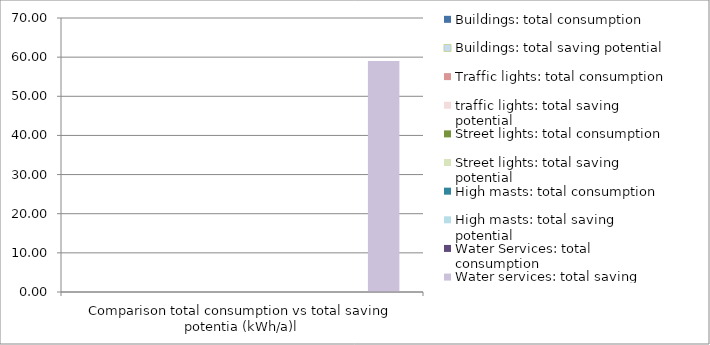
| Category | Buildings: total consumption | Buildings: total saving potential | Traffic lights: total consumption | traffic lights: total saving potential | Street lights: total consumption | Street lights: total saving potential | High masts: total consumption | High masts: total saving potential | Water Services: total consumption | Water services: total saving potential |
|---|---|---|---|---|---|---|---|---|---|---|
| 0 | 0 | 0 | 0 | 0 | 0 | 0 | 0 | 0 | 0 | 59 |